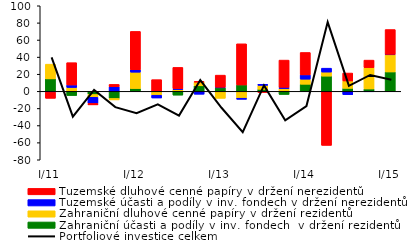
| Category | Zahraniční účasti a podíly v inv. fondech  v držení rezidentů  | Zahraniční dluhové cenné papíry v držení rezidentů  | Tuzemské účasti a podíly v inv. fondech v držení nerezidentů | Tuzemské dluhové cenné papíry v držení nerezidentů  |
|---|---|---|---|---|
| I/11 | 14.567 | 17.185 | -0.812 | -7.345 |
| II | -4.896 | 4.506 | 2.914 | 26.084 |
| III | -3.713 | -3.275 | -7.125 | -1.717 |
| IV | -8.33 | -1.701 | 5.325 | 2.798 |
| I/12 | 3.306 | 19.066 | 2.798 | 44.867 |
| II | -1.1 | -3.438 | -3.249 | 13.669 |
| III | -4.429 | 2.169 | 0.915 | 24.887 |
| IV | 6.453 | 4.343 | -3.402 | 0.733 |
| I/13 | 4.078 | -8.168 | 0.714 | 14.146 |
| II | 7.436 | -8.051 | -1.279 | 48.104 |
| III | 2.417 | 4.579 | 1.224 | -1.376 |
| IV | -3.652 | 3.278 | 1.402 | 31.82 |
| I/14 | 8.294 | 5.918 | 5.024 | 26.183 |
| II | 17.782 | 4.744 | 4.546 | -63.167 |
| III | 3.481 | 8.634 | -3.872 | 9.272 |
| IV | 2.772 | 24.934 | -0.485 | 8.788 |
| I/15 | 22.663 | 20.346 | 0.202 | 29.014 |